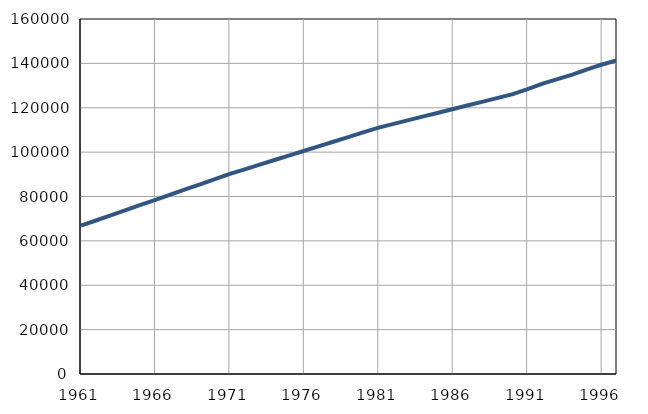
| Category | Population
size |
|---|---|
| 1961.0 | 66846 |
| 1962.0 | 69179 |
| 1963.0 | 71512 |
| 1964.0 | 73845 |
| 1965.0 | 76178 |
| 1966.0 | 78511 |
| 1967.0 | 80844 |
| 1968.0 | 83177 |
| 1969.0 | 85510 |
| 1970.0 | 87843 |
| 1971.0 | 90174 |
| 1972.0 | 92264 |
| 1973.0 | 94354 |
| 1974.0 | 96444 |
| 1975.0 | 98534 |
| 1976.0 | 100624 |
| 1977.0 | 102714 |
| 1978.0 | 104804 |
| 1979.0 | 106894 |
| 1980.0 | 108984 |
| 1981.0 | 111071 |
| 1982.0 | 112744 |
| 1983.0 | 114417 |
| 1984.0 | 116090 |
| 1985.0 | 117763 |
| 1986.0 | 119436 |
| 1987.0 | 121109 |
| 1988.0 | 122782 |
| 1989.0 | 124455 |
| 1990.0 | 126128 |
| 1991.0 | 128400 |
| 1992.0 | 130900 |
| 1993.0 | 132900 |
| 1994.0 | 134900 |
| 1995.0 | 137300 |
| 1996.0 | 139500 |
| 1997.0 | 141400 |